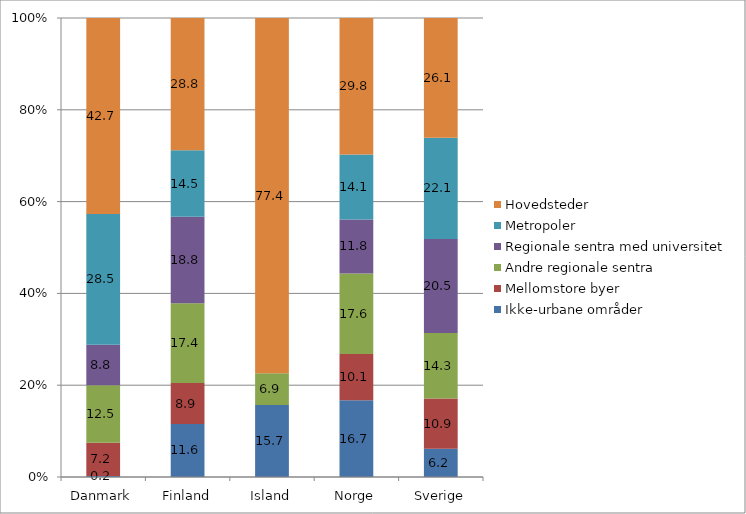
| Category | Ikke-urbane områder | Mellomstore byer | Andre regionale sentra | Regionale sentra med universitet | Metropoler | Hovedsteder |
|---|---|---|---|---|---|---|
| Danmark | 0.223 | 7.235 | 12.513 | 8.828 | 28.483 | 42.719 |
| Finland | 11.568 | 8.885 | 17.42 | 18.837 | 14.465 | 28.824 |
| Island | 15.687 | 0 | 6.925 | 0 | 0 | 77.388 |
| Norge | 16.716 | 10.059 | 17.569 | 11.768 | 14.13 | 29.759 |
| Sverige | 6.152 | 10.943 | 14.289 | 20.46 | 22.051 | 26.105 |